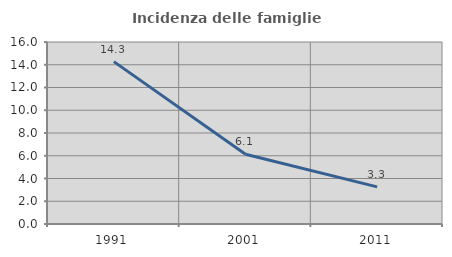
| Category | Incidenza delle famiglie numerose |
|---|---|
| 1991.0 | 14.274 |
| 2001.0 | 6.128 |
| 2011.0 | 3.263 |